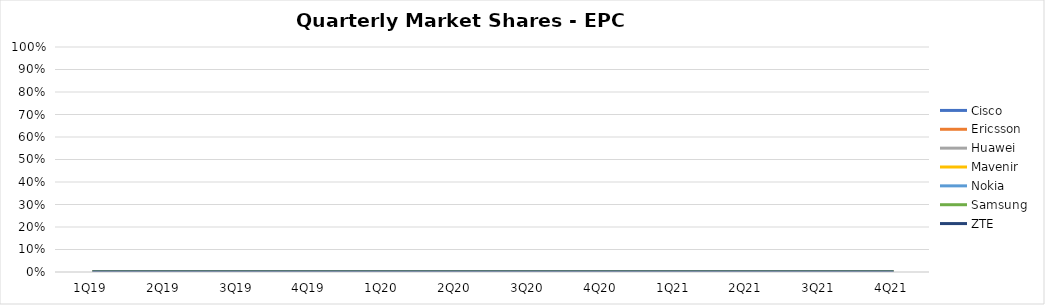
| Category | Cisco | Ericsson | Huawei | Mavenir | Nokia | Samsung | ZTE |
|---|---|---|---|---|---|---|---|
| 1Q19 | 0 | 0 | 0 | 0 | 0 | 0 | 0 |
| 2Q19 | 0 | 0 | 0 | 0 | 0 | 0 | 0 |
| 3Q19 | 0 | 0 | 0 | 0 | 0 | 0 | 0 |
| 4Q19 | 0 | 0 | 0 | 0 | 0 | 0 | 0 |
| 1Q20 | 0 | 0 | 0 | 0 | 0 | 0 | 0 |
| 2Q20 | 0 | 0 | 0 | 0 | 0 | 0 | 0 |
| 3Q20 | 0 | 0 | 0 | 0 | 0 | 0 | 0 |
| 4Q20 | 0 | 0 | 0 | 0 | 0 | 0 | 0 |
| 1Q21 | 0 | 0 | 0 | 0 | 0 | 0 | 0 |
| 2Q21 | 0 | 0 | 0 | 0 | 0 | 0 | 0 |
| 3Q21 | 0 | 0 | 0 | 0 | 0 | 0 | 0 |
| 4Q21 | 0 | 0 | 0 | 0 | 0 | 0 | 0 |